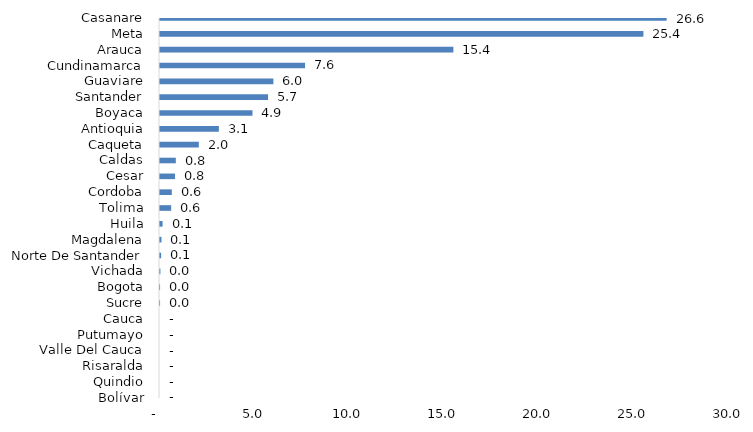
| Category | Series 0 |
|---|---|
| Bolívar | 0 |
| Quindio | 0 |
| Risaralda | 0 |
| Valle Del Cauca | 0 |
| Putumayo | 0 |
| Cauca | 0 |
| Sucre | 0.004 |
| Bogota | 0.004 |
| Vichada | 0.021 |
| Norte De Santander | 0.058 |
| Magdalena | 0.078 |
| Huila | 0.136 |
| Tolima | 0.585 |
| Cordoba | 0.62 |
| Cesar | 0.789 |
| Caldas | 0.83 |
| Caqueta | 2.04 |
| Antioquia | 3.092 |
| Boyaca | 4.86 |
| Santander | 5.678 |
| Guaviare | 5.956 |
| Cundinamarca | 7.621 |
| Arauca | 15.415 |
| Meta | 25.398 |
| Casanare | 26.619 |